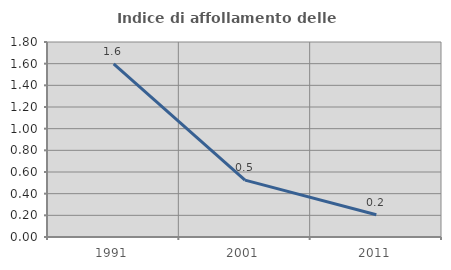
| Category | Indice di affollamento delle abitazioni  |
|---|---|
| 1991.0 | 1.597 |
| 2001.0 | 0.525 |
| 2011.0 | 0.205 |